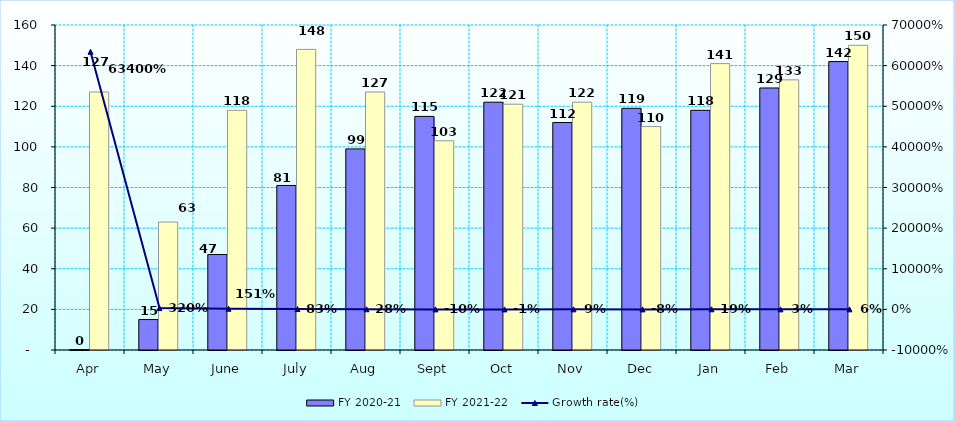
| Category | FY 2020-21 | FY 2021-22 |
|---|---|---|
| Apr | 0.2 | 127 |
| May | 15 | 63 |
| June | 47 | 118 |
| July | 81 | 148 |
| Aug | 99 | 127 |
| Sept | 115 | 103 |
| Oct | 122 | 121 |
| Nov | 112 | 122 |
| Dec | 119 | 110 |
| Jan | 118 | 141 |
| Feb | 129 | 133 |
| Mar | 142 | 150 |